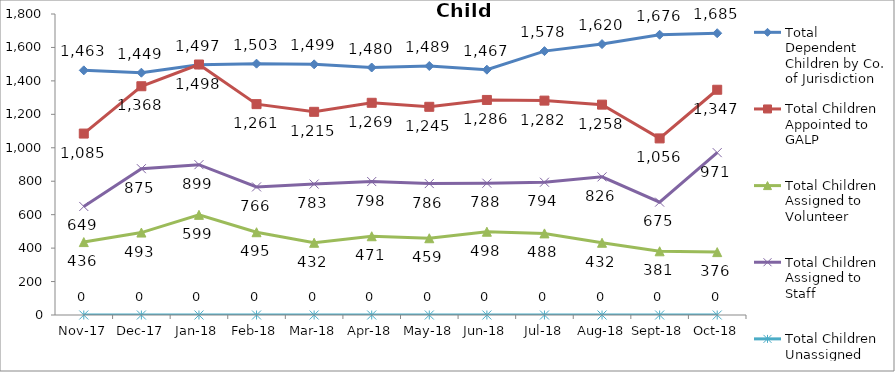
| Category | Total Dependent Children by Co. of Jurisdiction | Total Children Appointed to GALP | Total Children Assigned to Volunteer | Total Children Assigned to Staff | Total Children Unassigned |
|---|---|---|---|---|---|
| 2017-11-01 | 1463 | 1085 | 436 | 649 | 0 |
| 2017-12-01 | 1449 | 1368 | 493 | 875 | 0 |
| 2018-01-01 | 1497 | 1498 | 599 | 899 | 0 |
| 2018-02-01 | 1503 | 1261 | 495 | 766 | 0 |
| 2018-03-01 | 1499 | 1215 | 432 | 783 | 0 |
| 2018-04-01 | 1480 | 1269 | 471 | 798 | 0 |
| 2018-05-01 | 1489 | 1245 | 459 | 786 | 0 |
| 2018-06-01 | 1467 | 1286 | 498 | 788 | 0 |
| 2018-07-01 | 1578 | 1282 | 488 | 794 | 0 |
| 2018-08-01 | 1620 | 1258 | 432 | 826 | 0 |
| 2018-09-01 | 1676 | 1056 | 381 | 675 | 0 |
| 2018-10-01 | 1685 | 1347 | 376 | 971 | 0 |